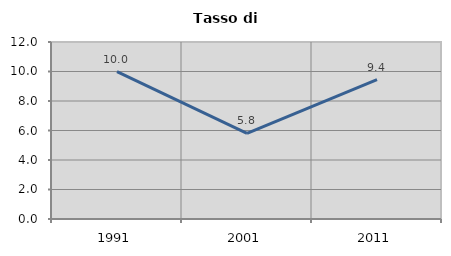
| Category | Tasso di disoccupazione   |
|---|---|
| 1991.0 | 9.993 |
| 2001.0 | 5.803 |
| 2011.0 | 9.444 |